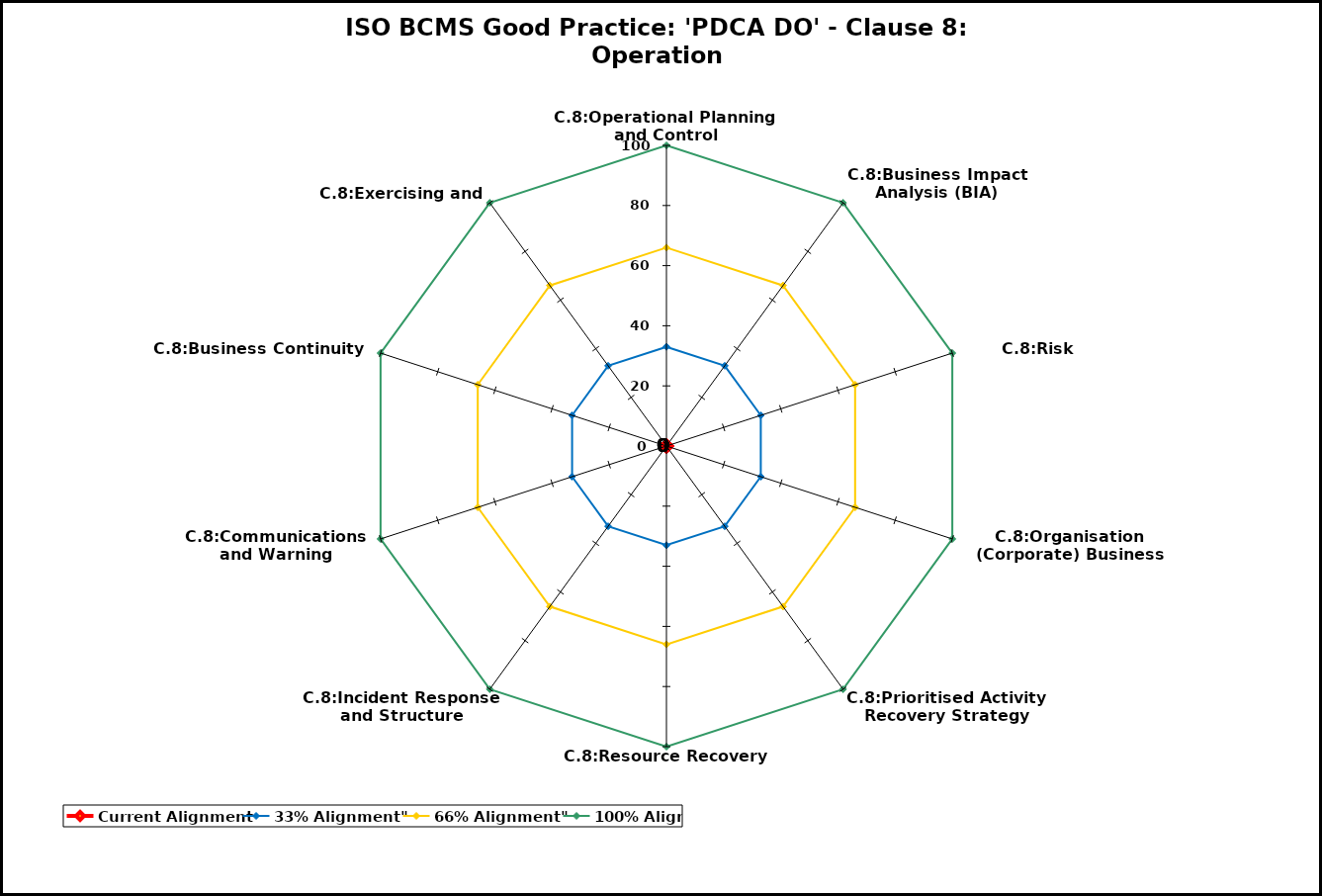
| Category | Current Alignment | 33% Alignment" | 66% Alignment" | 100% Alignment" |
|---|---|---|---|---|
| C.8:Operational Planning and Control | 0 | 33 | 66 | 100 |
| C.8:Business Impact Analysis (BIA) | 0 | 33 | 66 | 100 |
| C.8:Risk Assessment | 0 | 33 | 66 | 100 |
| C.8:Organisation (Corporate) Business Continuity Strategy | 0 | 33 | 66 | 100 |
| C.8:Prioritised Activity Recovery Strategy | 0 | 33 | 66 | 100 |
| C.8:Resource Recovery Stategy | 0 | 33 | 66 | 100 |
| C.8:Incident Response and Structure | 0 | 33 | 66 | 100 |
| C.8:Communications and Warning | 0 | 33 | 66 | 100 |
| C.8:Business Continuity Plans | 0 | 33 | 66 | 100 |
| C.8:Exercising and Testing | 0 | 33 | 66 | 100 |